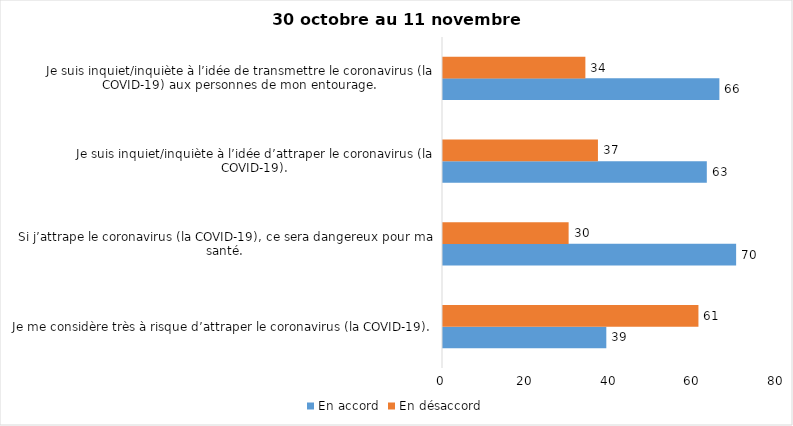
| Category | En accord | En désaccord |
|---|---|---|
| Je me considère très à risque d’attraper le coronavirus (la COVID-19). | 39 | 61 |
| Si j’attrape le coronavirus (la COVID-19), ce sera dangereux pour ma santé. | 70 | 30 |
| Je suis inquiet/inquiète à l’idée d’attraper le coronavirus (la COVID-19). | 63 | 37 |
| Je suis inquiet/inquiète à l’idée de transmettre le coronavirus (la COVID-19) aux personnes de mon entourage. | 66 | 34 |